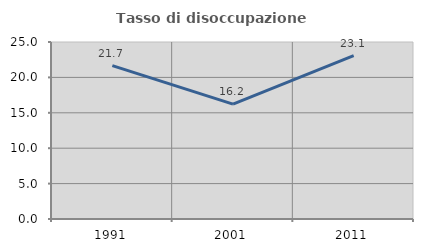
| Category | Tasso di disoccupazione giovanile  |
|---|---|
| 1991.0 | 21.667 |
| 2001.0 | 16.216 |
| 2011.0 | 23.077 |